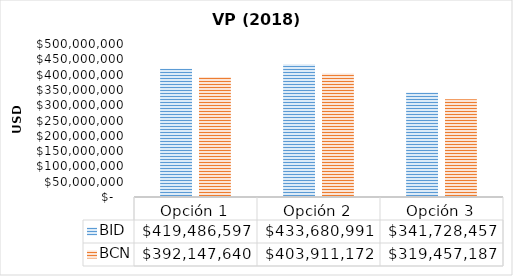
| Category | BID | BCN |
|---|---|---|
| Opción 1 | 419486596.717 | 392147640.48 |
| Opción 2 | 433680991.27 | 403911172.047 |
| Opción 3 | 341728457.458 | 319457187.252 |